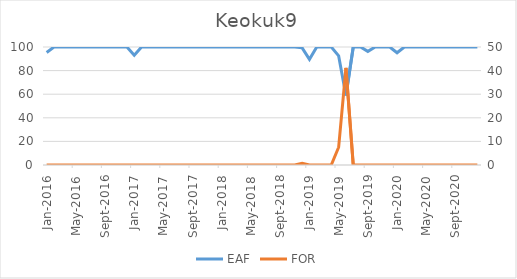
| Category | EAF |
|---|---|
| 2016-01-01 | 95.36 |
| 2016-02-01 | 100 |
| 2016-03-01 | 100 |
| 2016-04-01 | 100 |
| 2016-05-01 | 100 |
| 2016-06-01 | 100 |
| 2016-07-01 | 100 |
| 2016-08-01 | 100 |
| 2016-09-01 | 100 |
| 2016-10-01 | 100 |
| 2016-11-01 | 100 |
| 2016-12-01 | 100 |
| 2017-01-01 | 93.1 |
| 2017-02-01 | 100 |
| 2017-03-01 | 100 |
| 2017-04-01 | 100 |
| 2017-05-01 | 100 |
| 2017-06-01 | 100 |
| 2017-07-01 | 100 |
| 2017-08-01 | 100 |
| 2017-09-01 | 100 |
| 2017-10-01 | 100 |
| 2017-11-01 | 100 |
| 2017-12-01 | 100 |
| 2018-01-01 | 100 |
| 2018-02-01 | 100 |
| 2018-03-01 | 100 |
| 2018-04-01 | 100 |
| 2018-05-01 | 100 |
| 2018-06-01 | 100 |
| 2018-07-01 | 100 |
| 2018-08-01 | 100 |
| 2018-09-01 | 100 |
| 2018-10-01 | 100 |
| 2018-11-01 | 100 |
| 2018-12-01 | 99.25 |
| 2019-01-01 | 89.55 |
| 2019-02-01 | 100 |
| 2019-03-01 | 100 |
| 2019-04-01 | 99.9 |
| 2019-05-01 | 92.48 |
| 2019-06-01 | 58.85 |
| 2019-07-01 | 100 |
| 2019-08-01 | 100 |
| 2019-09-01 | 96.29 |
| 2019-10-01 | 100 |
| 2019-11-01 | 100 |
| 2019-12-01 | 100 |
| 2020-01-01 | 95.12 |
| 2020-02-01 | 100 |
| 2020-03-01 | 100 |
| 2020-04-01 | 100 |
| 2020-05-01 | 100 |
| 2020-06-01 | 100 |
| 2020-07-01 | 100 |
| 2020-08-01 | 100 |
| 2020-09-01 | 100 |
| 2020-10-01 | 100 |
| 2020-11-01 | 100 |
| 2020-12-01 | 100 |